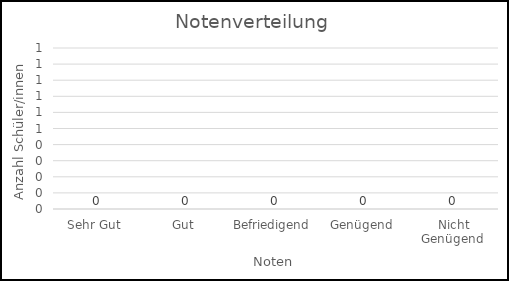
| Category | Häufigkeit  |
|---|---|
| Sehr Gut  | 0 |
| Gut  | 0 |
| Befriedigend  | 0 |
| Genügend  | 0 |
| Nicht Genügend  | 0 |